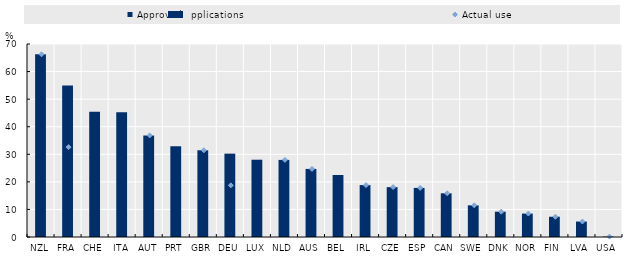
| Category | Approved applications |
|---|---|
| NZL | 66.273 |
| FRA | 54.931 |
| CHE | 45.432 |
| ITA | 45.204 |
| AUT | 36.839 |
| PRT | 32.95 |
| GBR | 31.466 |
| DEU | 30.236 |
| LUX | 28.034 |
| NLD | 27.965 |
| AUS | 24.691 |
| BEL | 22.494 |
| IRL | 18.83 |
| CZE | 18.094 |
| ESP | 17.806 |
| CAN | 15.857 |
| SWE | 11.483 |
| DNK | 9.186 |
| NOR | 8.497 |
| FIN | 7.35 |
| LVA | 5.614 |
| USA | 0.143 |